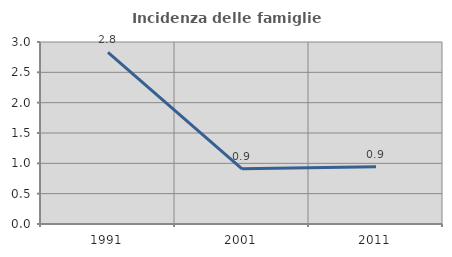
| Category | Incidenza delle famiglie numerose |
|---|---|
| 1991.0 | 2.83 |
| 2001.0 | 0.909 |
| 2011.0 | 0.943 |